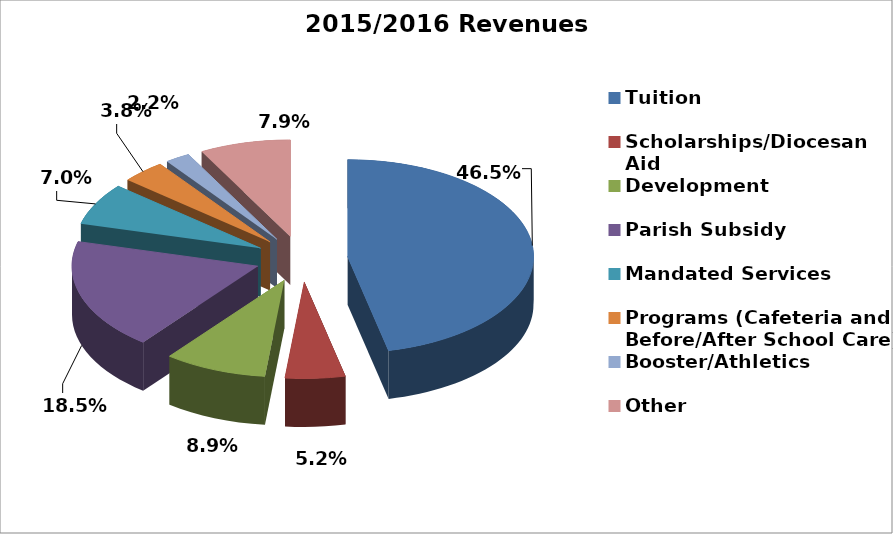
| Category | 2015/2016 Revenues (Audited) |
|---|---|
| Tuition | 0.465 |
| Scholarships/Diocesan Aid | 0.052 |
| Development | 0.089 |
| Parish Subsidy | 0.185 |
| Mandated Services | 0.07 |
| Programs (Cafeteria and Before/After School Care) | 0.038 |
| Booster/Athletics | 0.022 |
| Other | 0.079 |